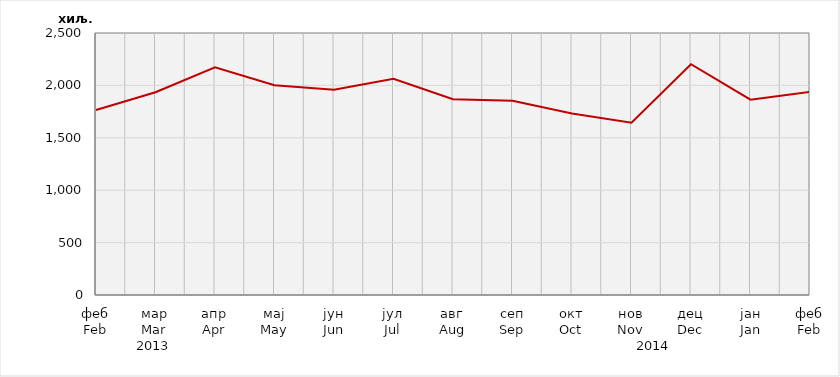
| Category | Нето тежина заклане стоке                              Net weight of  slaughtered livestock |
|---|---|
| феб
Feb | 1764938.6 |
| мар
Mar | 1934364.7 |
| апр
Apr | 2171949.16 |
| мај
May | 2000890.05 |
| јун
Jun | 1958717.5 |
| јул
Jul | 2062735.23 |
| авг
Aug | 1867860.8 |
| сеп
Sep | 1852800.6 |
| окт
Oct | 1731807.5 |
| нов
Nov | 1643818.93 |
| дец
Dec | 2201954.6 |
| јан
Jan | 1864263.38 |
| феб
Feb | 1937876.26 |